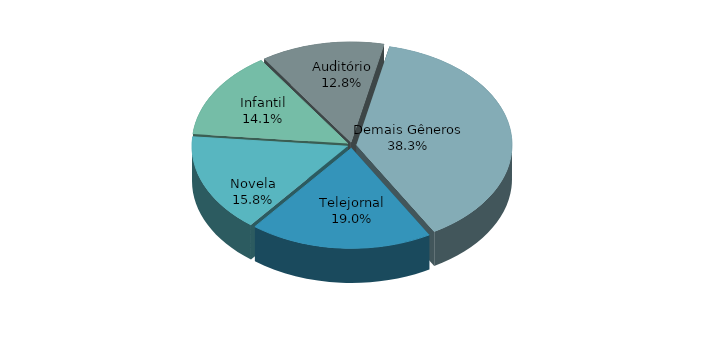
| Category | Series 0 |
|---|---|
| Telejornal | 0.19 |
| Novela | 0.158 |
| Infantil | 0.141 |
| Auditório | 0.128 |
| Demais Gêneros | 0.383 |